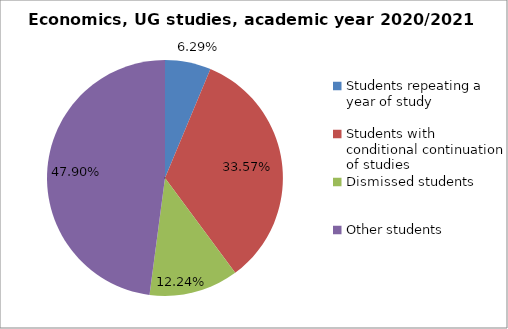
| Category | Series 0 |
|---|---|
| Students repeating a year of study | 18 |
| Students with conditional continuation of studies | 96 |
| Dismissed students | 35 |
| Other students | 137 |